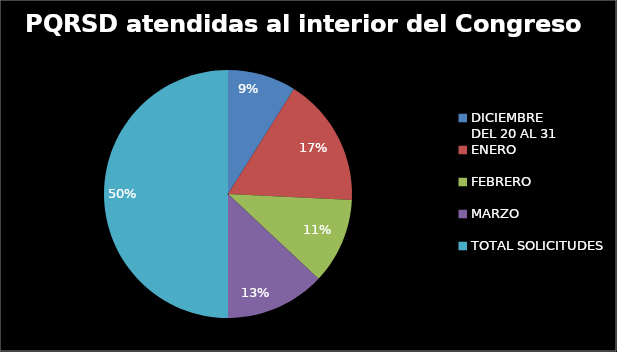
| Category |  PQRSD atendidas al interior del Congreso |
|---|---|
| DICIEMBRE 
DEL 20 AL 31 | 35 |
| ENERO | 66 |
| FEBRERO | 44 |
| MARZO | 51 |
| TOTAL SOLICITUDES | 196 |